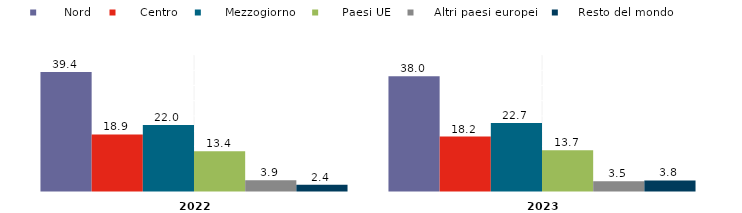
| Category |       Nord |      Centro |      Mezzogiorno |      Paesi UE |     Altri paesi europei |     Resto del mondo |
|---|---|---|---|---|---|---|
| 2022.0 | 39.4 | 18.9 | 22 | 13.4 | 3.9 | 2.4 |
| 2023.0 | 38 | 18.2 | 22.7 | 13.7 | 3.5 | 3.8 |